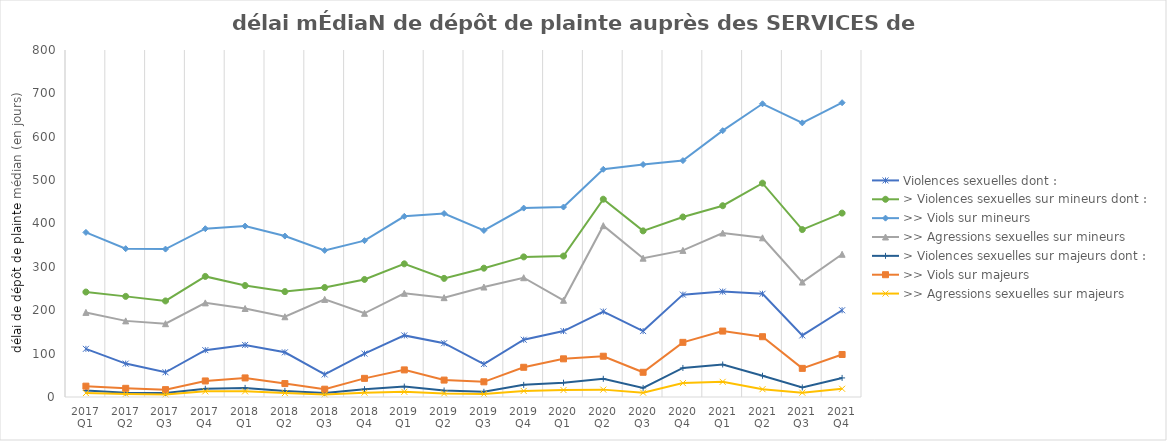
| Category | Violences sexuelles dont : | > Violences sexuelles sur mineurs dont : | >> Viols sur mineurs | >> Agressions sexuelles sur mineurs | > Violences sexuelles sur majeurs dont : | >> Viols sur majeurs | >> Agressions sexuelles sur majeurs |
|---|---|---|---|---|---|---|---|
| 2017 Q1 | 111 | 242 | 379.5 | 195 | 15 | 25 | 9 |
| 2017 Q2 | 77 | 232 | 342 | 175.5 | 10 | 20 | 7 |
| 2017 Q3 | 57 | 221.5 | 341 | 169 | 9 | 17 | 6 |
| 2017 Q4 | 108 | 278 | 388 | 217 | 19 | 37 | 13 |
| 2018 Q1 | 120 | 257 | 394 | 204 | 21 | 44 | 13 |
| 2018 Q2 | 103 | 243 | 371 | 185 | 14 | 31 | 9 |
| 2018 Q3 | 52 | 252.5 | 338 | 225 | 9 | 18 | 6 |
| 2018 Q4 | 100 | 271 | 360.5 | 193 | 18 | 43 | 10 |
| 2019 Q1 | 142 | 307 | 416.5 | 239 | 24 | 62.5 | 12 |
| 2019 Q2 | 124 | 273.5 | 423 | 229 | 15 | 39 | 8 |
| 2019 Q3 | 76 | 297 | 384 | 253.5 | 12 | 35 | 7 |
| 2019 Q4 | 132 | 323 | 435.5 | 275 | 28 | 68.5 | 14 |
| 2020 Q1 | 152 | 325 | 438 | 223 | 33 | 88 | 16 |
| 2020 Q2 | 197 | 456 | 525 | 395 | 42 | 94 | 17 |
| 2020 Q3 | 152 | 383 | 536 | 320 | 21 | 57 | 10 |
| 2020 Q4 | 236 | 415 | 545 | 338 | 67 | 126 | 32 |
| 2021 Q1 | 243 | 441 | 614 | 378 | 75 | 152 | 35 |
| 2021 Q2 | 238 | 493 | 676 | 367 | 49 | 139 | 18 |
| 2021 Q3 | 142 | 386 | 632 | 265 | 22 | 66 | 10 |
| 2021 Q4 | 200 | 424 | 678.5 | 329 | 44 | 98 | 19 |